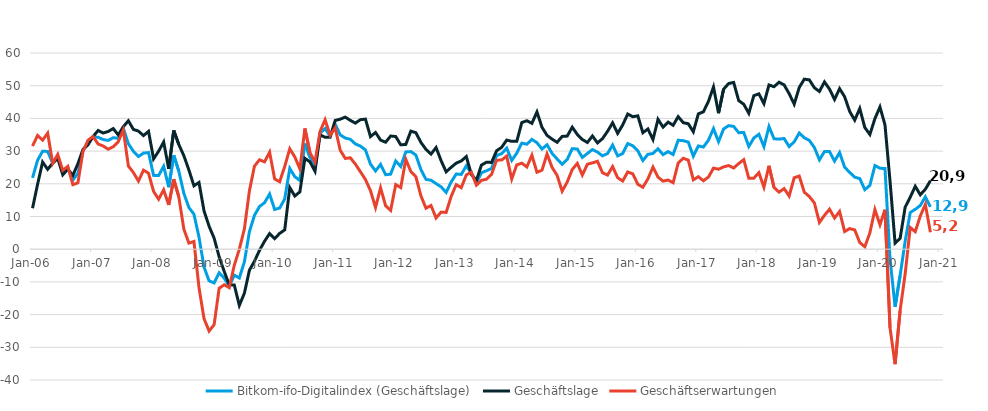
| Category | Bitkom-ifo-Digitalindex (Geschäftslage) | Geschäftslage | Geschäftserwartungen |
|---|---|---|---|
| 2006-01-01 | 21.82 | 12.51 | 31.54 |
| 2006-02-01 | 27.18 | 19.82 | 34.79 |
| 2006-03-01 | 29.97 | 26.65 | 33.34 |
| 2006-04-01 | 29.89 | 24.43 | 35.49 |
| 2006-05-01 | 26.29 | 26.31 | 26.26 |
| 2006-06-01 | 28.38 | 27.79 | 28.97 |
| 2006-07-01 | 23.44 | 22.75 | 24.12 |
| 2006-08-01 | 24.91 | 24.47 | 25.35 |
| 2006-09-01 | 21.15 | 22.57 | 19.73 |
| 2006-10-01 | 23.21 | 26.17 | 20.3 |
| 2006-11-01 | 30.18 | 30.48 | 29.89 |
| 2006-12-01 | 32.63 | 31.93 | 33.33 |
| 2007-01-01 | 34.46 | 34.47 | 34.45 |
| 2007-02-01 | 34.22 | 36.29 | 32.17 |
| 2007-03-01 | 33.54 | 35.53 | 31.57 |
| 2007-04-01 | 33.26 | 36 | 30.57 |
| 2007-05-01 | 34.1 | 36.89 | 31.35 |
| 2007-06-01 | 33.92 | 34.94 | 32.9 |
| 2007-07-01 | 36.98 | 37.46 | 36.49 |
| 2007-08-01 | 32.26 | 39.28 | 25.45 |
| 2007-09-01 | 29.93 | 36.63 | 23.43 |
| 2007-10-01 | 28.34 | 36.11 | 20.83 |
| 2007-11-01 | 29.39 | 34.74 | 24.17 |
| 2007-12-01 | 29.55 | 36.04 | 23.23 |
| 2008-01-01 | 22.58 | 27.61 | 17.67 |
| 2008-02-01 | 22.52 | 29.98 | 15.29 |
| 2008-03-01 | 25.36 | 32.78 | 18.17 |
| 2008-04-01 | 18.97 | 24.55 | 13.53 |
| 2008-05-01 | 28.73 | 36.3 | 21.41 |
| 2008-06-01 | 23.87 | 32.02 | 16 |
| 2008-07-01 | 17.08 | 28.6 | 6.13 |
| 2008-08-01 | 12.75 | 24.23 | 1.86 |
| 2008-09-01 | 10.71 | 19.39 | 2.37 |
| 2008-10-01 | 3.73 | 20.41 | -11.69 |
| 2008-11-01 | -5.45 | 11.73 | -21.23 |
| 2008-12-01 | -9.67 | 7.03 | -25.02 |
| 2009-01-01 | -10.32 | 3.38 | -23.09 |
| 2009-02-01 | -7.2 | -2.34 | -11.95 |
| 2009-03-01 | -8.85 | -6.8 | -10.88 |
| 2009-04-01 | -11.32 | -10.89 | -11.76 |
| 2009-05-01 | -7.95 | -10.95 | -4.9 |
| 2009-06-01 | -8.8 | -17.2 | -0.01 |
| 2009-07-01 | -3.87 | -13.46 | 6.21 |
| 2009-08-01 | 5.37 | -6.42 | 17.88 |
| 2009-09-01 | 10.37 | -3.66 | 25.41 |
| 2009-10-01 | 13.05 | -0.34 | 27.34 |
| 2009-11-01 | 14.23 | 2.44 | 26.71 |
| 2009-12-01 | 16.87 | 4.78 | 29.67 |
| 2010-01-01 | 12.15 | 3.22 | 21.47 |
| 2010-02-01 | 12.59 | 4.84 | 20.63 |
| 2010-03-01 | 15.39 | 5.91 | 25.31 |
| 2010-04-01 | 24.7 | 18.84 | 30.72 |
| 2010-05-01 | 22.16 | 16.27 | 28.21 |
| 2010-06-01 | 21.03 | 17.53 | 24.58 |
| 2010-07-01 | 32.31 | 27.78 | 36.93 |
| 2010-08-01 | 28.13 | 26.71 | 29.55 |
| 2010-09-01 | 25.23 | 23.84 | 26.62 |
| 2010-10-01 | 35.48 | 34.97 | 36 |
| 2010-11-01 | 36.89 | 34.23 | 39.59 |
| 2010-12-01 | 34.56 | 34.28 | 34.84 |
| 2011-01-01 | 38.25 | 39.37 | 37.12 |
| 2011-02-01 | 34.96 | 39.76 | 30.26 |
| 2011-03-01 | 34 | 40.39 | 27.77 |
| 2011-04-01 | 33.61 | 39.4 | 27.95 |
| 2011-05-01 | 32.2 | 38.56 | 26.02 |
| 2011-06-01 | 31.52 | 39.61 | 23.69 |
| 2011-07-01 | 30.36 | 39.78 | 21.31 |
| 2011-08-01 | 26.02 | 34.44 | 17.9 |
| 2011-09-01 | 23.92 | 35.69 | 12.74 |
| 2011-10-01 | 25.94 | 33.36 | 18.76 |
| 2011-11-01 | 22.78 | 32.72 | 13.28 |
| 2011-12-01 | 22.95 | 34.61 | 11.87 |
| 2012-01-01 | 26.99 | 34.46 | 19.76 |
| 2012-02-01 | 25.29 | 31.92 | 18.84 |
| 2012-03-01 | 29.75 | 32.04 | 27.48 |
| 2012-04-01 | 29.85 | 36.1 | 23.77 |
| 2012-05-01 | 28.79 | 35.63 | 22.15 |
| 2012-06-01 | 24.34 | 32.66 | 16.32 |
| 2012-07-01 | 21.35 | 30.53 | 12.53 |
| 2012-08-01 | 21.09 | 29.08 | 13.38 |
| 2012-09-01 | 20.06 | 31.09 | 9.55 |
| 2012-10-01 | 19.06 | 27.07 | 11.34 |
| 2012-11-01 | 17.36 | 23.66 | 11.25 |
| 2012-12-01 | 20.56 | 25.06 | 16.15 |
| 2013-01-01 | 23 | 26.32 | 19.74 |
| 2013-02-01 | 22.86 | 26.99 | 18.81 |
| 2013-03-01 | 25.51 | 28.33 | 22.72 |
| 2013-04-01 | 23.21 | 22.85 | 23.57 |
| 2013-05-01 | 20.32 | 21.06 | 19.57 |
| 2013-06-01 | 23.38 | 25.72 | 21.06 |
| 2013-07-01 | 23.99 | 26.6 | 21.41 |
| 2013-08-01 | 24.7 | 26.53 | 22.88 |
| 2013-09-01 | 28.65 | 30.1 | 27.22 |
| 2013-10-01 | 29.2 | 31.14 | 27.27 |
| 2013-11-01 | 30.9 | 33.37 | 28.46 |
| 2013-12-01 | 27.15 | 32.99 | 21.46 |
| 2014-01-01 | 29.37 | 32.99 | 25.8 |
| 2014-02-01 | 32.44 | 38.73 | 26.31 |
| 2014-03-01 | 32.11 | 39.28 | 25.16 |
| 2014-04-01 | 33.57 | 38.49 | 28.75 |
| 2014-05-01 | 32.57 | 41.96 | 23.53 |
| 2014-06-01 | 30.64 | 37.3 | 24.16 |
| 2014-07-01 | 31.95 | 34.81 | 29.13 |
| 2014-08-01 | 29.3 | 33.66 | 25.01 |
| 2014-09-01 | 27.58 | 32.69 | 22.57 |
| 2014-10-01 | 25.96 | 34.49 | 17.74 |
| 2014-11-01 | 27.45 | 34.59 | 20.53 |
| 2014-12-01 | 30.75 | 37.32 | 24.37 |
| 2015-01-01 | 30.63 | 35.1 | 26.24 |
| 2015-02-01 | 28.05 | 33.55 | 22.68 |
| 2015-03-01 | 29.28 | 32.63 | 25.98 |
| 2015-04-01 | 30.47 | 34.62 | 26.4 |
| 2015-05-01 | 29.69 | 32.51 | 26.89 |
| 2015-06-01 | 28.54 | 33.81 | 23.38 |
| 2015-07-01 | 29.26 | 36.06 | 22.67 |
| 2015-08-01 | 31.86 | 38.65 | 25.27 |
| 2015-09-01 | 28.53 | 35.42 | 21.85 |
| 2015-10-01 | 29.27 | 38 | 20.86 |
| 2015-11-01 | 32.31 | 41.34 | 23.62 |
| 2015-12-01 | 31.62 | 40.52 | 23.05 |
| 2016-01-01 | 30.08 | 40.78 | 19.86 |
| 2016-02-01 | 27.12 | 35.62 | 18.93 |
| 2016-03-01 | 29.01 | 36.77 | 21.51 |
| 2016-04-01 | 29.28 | 33.53 | 25.11 |
| 2016-05-01 | 30.71 | 39.72 | 22.04 |
| 2016-06-01 | 28.92 | 37.34 | 20.81 |
| 2016-07-01 | 29.84 | 38.87 | 21.15 |
| 2016-08-01 | 28.95 | 37.9 | 20.34 |
| 2016-09-01 | 33.33 | 40.53 | 26.34 |
| 2016-10-01 | 33.19 | 38.7 | 27.81 |
| 2016-11-01 | 32.75 | 38.37 | 27.25 |
| 2016-12-01 | 28.45 | 35.91 | 21.22 |
| 2017-01-01 | 31.58 | 41.39 | 22.18 |
| 2017-02-01 | 31.24 | 42.02 | 20.93 |
| 2017-03-01 | 33.35 | 45.21 | 22.06 |
| 2017-04-01 | 36.88 | 49.61 | 24.8 |
| 2017-05-01 | 32.88 | 41.6 | 24.47 |
| 2017-06-01 | 36.75 | 48.93 | 25.17 |
| 2017-07-01 | 37.79 | 50.66 | 25.58 |
| 2017-08-01 | 37.55 | 51 | 24.83 |
| 2017-09-01 | 35.63 | 45.45 | 26.2 |
| 2017-10-01 | 35.7 | 44.32 | 27.38 |
| 2017-11-01 | 31.41 | 41.57 | 21.67 |
| 2017-12-01 | 34 | 46.95 | 21.73 |
| 2018-01-01 | 35.15 | 47.51 | 23.41 |
| 2018-02-01 | 31.38 | 44.51 | 18.95 |
| 2018-03-01 | 37.54 | 50.22 | 25.51 |
| 2018-04-01 | 33.78 | 49.7 | 18.88 |
| 2018-05-01 | 33.66 | 51.07 | 17.45 |
| 2018-06-01 | 33.85 | 50.24 | 18.54 |
| 2018-07-01 | 31.38 | 47.57 | 16.26 |
| 2018-08-01 | 32.84 | 44.36 | 21.86 |
| 2018-09-01 | 35.52 | 49.45 | 22.38 |
| 2018-10-01 | 34.08 | 52 | 17.43 |
| 2018-11-01 | 33.27 | 51.79 | 16.11 |
| 2018-12-01 | 31.1 | 49.38 | 14.16 |
| 2019-01-01 | 27.33 | 48.24 | 8.18 |
| 2019-02-01 | 29.85 | 51.16 | 10.35 |
| 2019-03-01 | 29.86 | 48.96 | 12.23 |
| 2019-04-01 | 26.94 | 45.79 | 9.54 |
| 2019-05-01 | 29.56 | 49.11 | 11.55 |
| 2019-06-01 | 25.07 | 46.62 | 5.4 |
| 2019-07-01 | 23.5 | 42.13 | 6.3 |
| 2019-08-01 | 22.04 | 39.47 | 5.89 |
| 2019-09-01 | 21.58 | 43.03 | 2.03 |
| 2019-10-01 | 18.22 | 37.21 | 0.75 |
| 2019-11-01 | 19.51 | 35.08 | 4.98 |
| 2019-12-01 | 25.59 | 39.92 | 12.13 |
| 2020-01-01 | 24.76 | 43.5 | 7.47 |
| 2020-02-01 | 24.66 | 38.02 | 12.05 |
| 2020-03-01 | -2.9 | 20.81 | -24.07 |
| 2020-04-01 | -17.59 | 1.86 | -35.16 |
| 2020-05-01 | -8.02 | 3.31 | -18.72 |
| 2020-06-01 | 2.41 | 12.86 | -7.53 |
| 2020-07-01 | 11.21 | 15.89 | 6.63 |
| 2020-08-01 | 12.19 | 19.24 | 5.36 |
| 2020-09-01 | 13.37 | 16.64 | 10.15 |
| 2020-10-01 | 16.02 | 18.34 | 13.72 |
| 2020-11-01 | 12.92 | 20.93 | 5.2 |